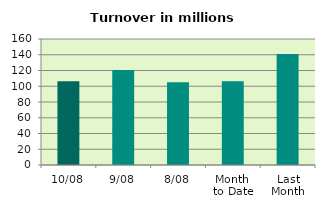
| Category | Series 0 |
|---|---|
| 10/08 | 106.444 |
| 9/08 | 120.59 |
| 8/08 | 105.192 |
| Month 
to Date | 106.455 |
| Last
Month | 140.832 |